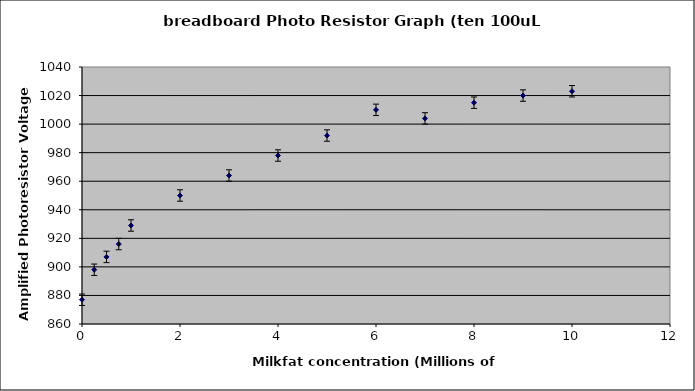
| Category | Series 0 |
|---|---|
| 0.0 | 877 |
| 0.25 | 898 |
| 0.5 | 907 |
| 0.75 | 916 |
| 1.0 | 929 |
| 2.0 | 950 |
| 3.0 | 964 |
| 4.0 | 978 |
| 5.0 | 992 |
| 6.0 | 1010 |
| 7.0 | 1004 |
| 8.0 | 1015 |
| 9.0 | 1020 |
| 10.0 | 1023 |